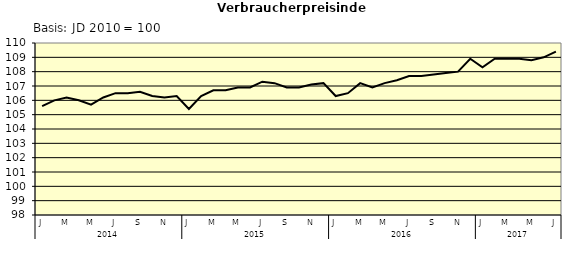
| Category | Series 0 |
|---|---|
| 0 | 105.6 |
| 1 | 106 |
| 2 | 106.2 |
| 3 | 106 |
| 4 | 105.7 |
| 5 | 106.2 |
| 6 | 106.5 |
| 7 | 106.5 |
| 8 | 106.6 |
| 9 | 106.3 |
| 10 | 106.2 |
| 11 | 106.3 |
| 12 | 105.4 |
| 13 | 106.3 |
| 14 | 106.7 |
| 15 | 106.7 |
| 16 | 106.9 |
| 17 | 106.9 |
| 18 | 107.3 |
| 19 | 107.2 |
| 20 | 106.9 |
| 21 | 106.9 |
| 22 | 107.1 |
| 23 | 107.2 |
| 24 | 106.3 |
| 25 | 106.5 |
| 26 | 107.2 |
| 27 | 106.9 |
| 28 | 107.2 |
| 29 | 107.4 |
| 30 | 107.7 |
| 31 | 107.7 |
| 32 | 107.8 |
| 33 | 107.9 |
| 34 | 108 |
| 35 | 108.9 |
| 36 | 108.3 |
| 37 | 108.9 |
| 38 | 108.9 |
| 39 | 108.9 |
| 40 | 108.8 |
| 41 | 109 |
| 42 | 109.4 |